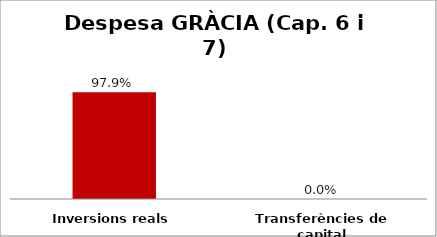
| Category | Series 0 |
|---|---|
| Inversions reals | 0.979 |
| Transferències de capital | 0 |